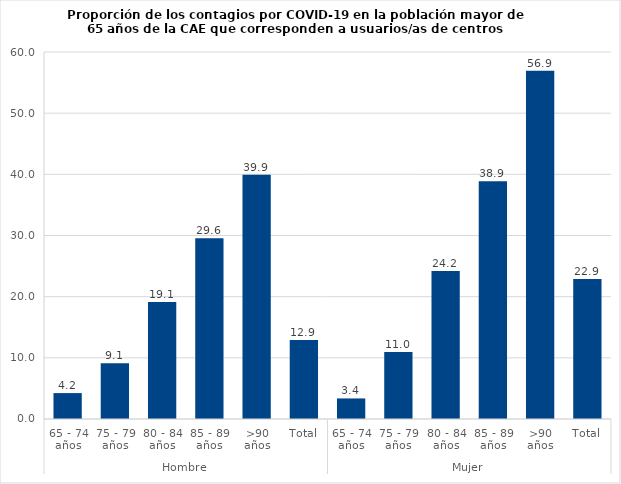
| Category | Series 0 |
|---|---|
| 0 | 4.237 |
| 1 | 9.117 |
| 2 | 19.129 |
| 3 | 29.562 |
| 4 | 39.917 |
| 5 | 12.913 |
| 6 | 3.361 |
| 7 | 10.962 |
| 8 | 24.204 |
| 9 | 38.853 |
| 10 | 56.929 |
| 11 | 22.884 |